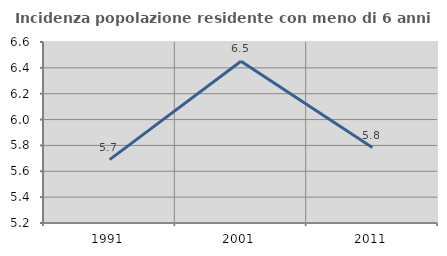
| Category | Incidenza popolazione residente con meno di 6 anni |
|---|---|
| 1991.0 | 5.69 |
| 2001.0 | 6.452 |
| 2011.0 | 5.783 |